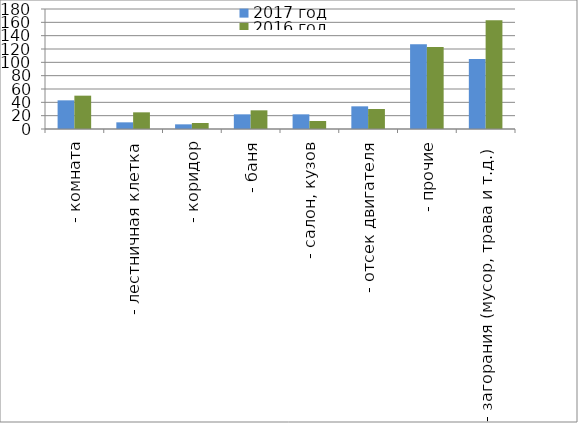
| Category | 2017 год | 2016 год |
|---|---|---|
|  - комната | 43 | 50 |
|  - лестничная клетка | 10 | 25 |
|  - коридор | 7 | 9 |
|  - баня | 22 | 28 |
|  - салон, кузов | 22 | 12 |
|  - отсек двигателя | 34 | 30 |
| - прочие | 127 | 123 |
| - загорания (мусор, трава и т.д.)  | 105 | 163 |